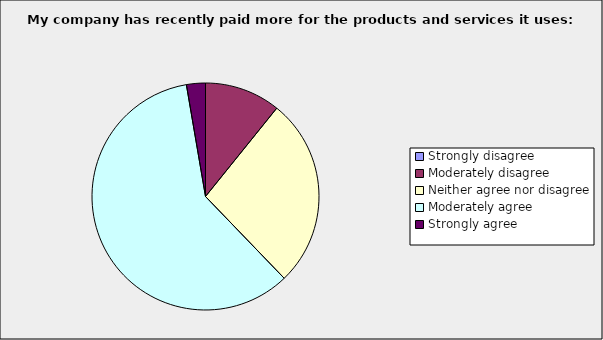
| Category | Series 0 |
|---|---|
| Strongly disagree | 0 |
| Moderately disagree | 0.108 |
| Neither agree nor disagree | 0.27 |
| Moderately agree | 0.595 |
| Strongly agree | 0.027 |